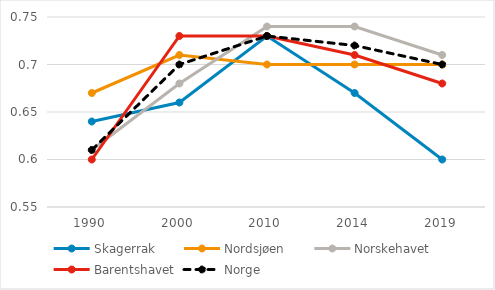
| Category | Skagerrak | Nordsjøen | Norskehavet | Barentshavet | Norge |
|---|---|---|---|---|---|
| 1990.0 | 0.64 | 0.67 | 0.61 | 0.6 | 0.61 |
| 2000.0 | 0.66 | 0.71 | 0.68 | 0.73 | 0.7 |
| 2010.0 | 0.73 | 0.7 | 0.74 | 0.73 | 0.73 |
| 2014.0 | 0.67 | 0.7 | 0.74 | 0.71 | 0.72 |
| 2019.0 | 0.6 | 0.7 | 0.71 | 0.68 | 0.7 |